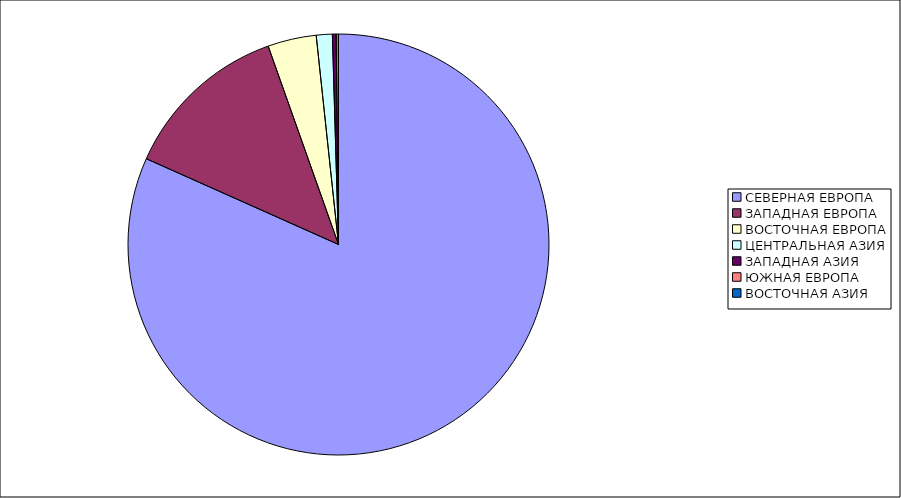
| Category | Оборот |
|---|---|
| СЕВЕРНАЯ ЕВРОПА | 81.679 |
| ЗАПАДНАЯ ЕВРОПА | 12.899 |
| ВОСТОЧНАЯ ЕВРОПА | 3.729 |
| ЦЕНТРАЛЬНАЯ АЗИЯ | 1.229 |
| ЗАПАДНАЯ АЗИЯ | 0.287 |
| ЮЖНАЯ ЕВРОПА | 0.169 |
| ВОСТОЧНАЯ АЗИЯ | 0.009 |